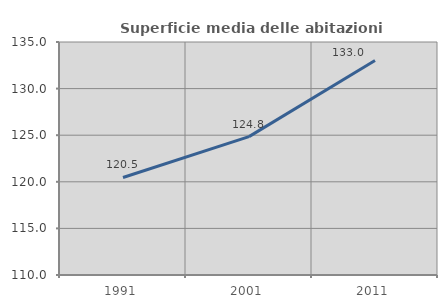
| Category | Superficie media delle abitazioni occupate |
|---|---|
| 1991.0 | 120.462 |
| 2001.0 | 124.848 |
| 2011.0 | 133.011 |